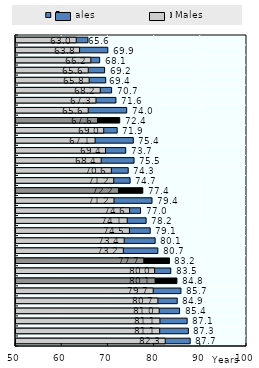
| Category |  Females |  Males |
|---|---|---|
| Papua New Guinea | 65.576 | 63.039 |
| Myanmar | 69.874 | 63.761 |
| Pakistan | 68.109 | 66.194 |
| Fiji | 69.178 | 65.641 |
| Lao PDR | 69.417 | 65.838 |
| India | 70.692 | 68.239 |
| Cambodia | 71.629 | 67.312 |
| Mongolia | 73.961 | 65.631 |
| Asia Pacific-LM/L | 72.448 | 67.638 |
| Nepal | 71.9 | 68.989 |
| Philippines | 75.387 | 67.123 |
| Indonesia | 73.748 | 69.375 |
| Korea, DPR | 75.549 | 68.435 |
| Bangladesh | 74.291 | 70.637 |
| Solomon Islands | 74.697 | 71.158 |
| Asia Pacific-UM | 77.444 | 72.182 |
| Viet Nam | 79.442 | 71.207 |
| Brunei Darussalam | 76.96 | 74.593 |
| Malaysia | 78.167 | 74.075 |
| China | 79.051 | 74.549 |
| Sri Lanka | 80.121 | 73.415 |
| Thailand | 80.704 | 73.228 |
| OECD | 83.216 | 77.663 |
| New Zealand | 83.5 | 80 |
| Asia Pacific-H | 84.829 | 80.112 |
| Korea, Rep. | 85.7 | 79.7 |
| Australia | 84.9 | 80.7 |
| Singapore | 85.4 | 81 |
| Macau, China | 87.051 | 81.149 |
| Japan | 87.32 | 81.1 |
| Hong Kong, China | 87.7 | 82.3 |